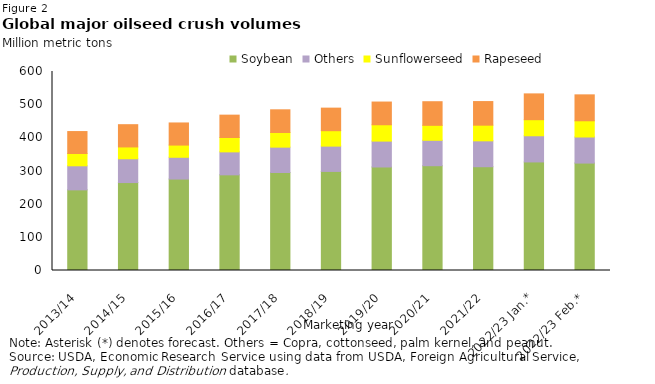
| Category | Soybean | Others | Sunflowerseed | Rapeseed |
|---|---|---|---|---|
| 2013/14 | 243.122 | 72.581 | 36.997 | 66.232 |
| 2014/15 | 265.139 | 71.751 | 35.674 | 67.092 |
| 2015/16 | 275.645 | 65.711 | 36.795 | 66.697 |
| 2016/17 | 288.441 | 69.22 | 43.331 | 67.421 |
| 2017/18 | 295.495 | 76.401 | 44.165 | 68.45 |
| 2018/19 | 298.739 | 76.269 | 46.518 | 68.044 |
| 2019/20 | 312.101 | 78.047 | 49.286 | 68.49 |
| 2020/21 | 315.943 | 76.673 | 45.099 | 71.194 |
| 2021/22 | 312.887 | 78.075 | 47.215 | 71.164 |
| 2022/23 Jan.* | 327.323 | 78.919 | 48.472 | 77.802 |
| 2022/23 Feb.* | 323.897 | 78.605 | 48.934 | 78.142 |